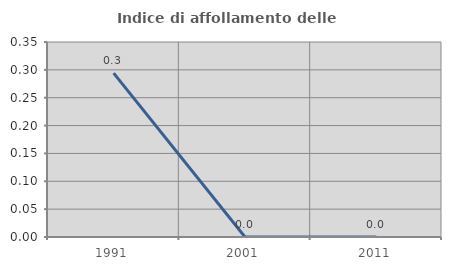
| Category | Indice di affollamento delle abitazioni  |
|---|---|
| 1991.0 | 0.294 |
| 2001.0 | 0 |
| 2011.0 | 0 |